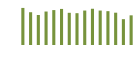
| Category | Saldo [ (1)-(2) ] |
|---|---|
| 0 | 329612.931 |
| 1 | 291358.085 |
| 2 | 266512.131 |
| 3 | 297562.723 |
| 4 | 310243.352 |
| 5 | 320714.531 |
| 6 | 286229.119 |
| 7 | 282809.198 |
| 8 | 306315.684 |
| 9 | 322195.815 |
| 10 | 306185.726 |
| 11 | 300797.708 |
| 12 | 287185.489 |
| 13 | 229607.519 |
| 14 | 263735.315 |